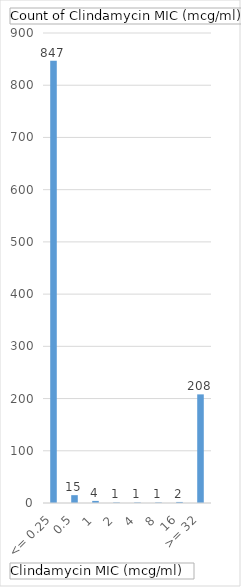
| Category | Total |
|---|---|
| <= 0.25 | 847 |
| 0.5 | 15 |
| 1 | 4 |
| 2 | 1 |
| 4 | 1 |
| 8 | 1 |
| 16 | 2 |
| >= 32 | 208 |